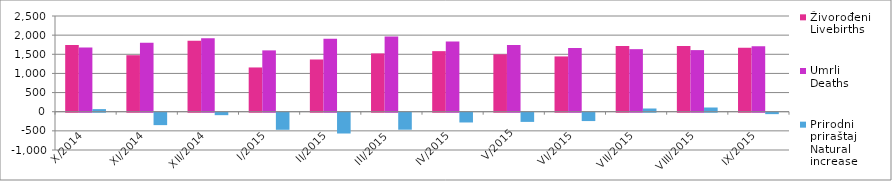
| Category | Živorođeni
Livebirths | Umrli
Deaths | Prirodni
priraštaj
Natural
increase |
|---|---|---|---|
| X/2014 | 1744 | 1676 | 68 |
| XI/2014 | 1476 | 1800 | -324 |
| XII/2014 | 1854 | 1918 | -64 |
| I/2015 | 1156 | 1602 | -446 |
| II/2015 | 1364 | 1907 | -543 |
| III/2015 | 1523 | 1967 | -444 |
| IV/2015 | 1582 | 1837 | -255 |
| V/2015 | 1500 | 1740 | -240 |
| VI/2015 | 1444 | 1662 | -218 |
| VII/2015 | 1718 | 1634 | 84 |
| VIII/2015 | 1719 | 1609 | 110 |
| IX/2015 | 1672 | 1709 | -37 |